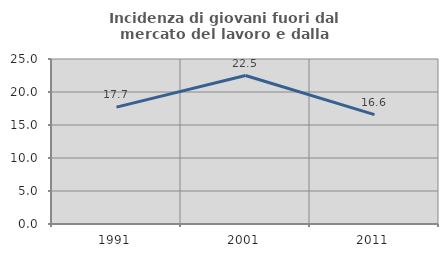
| Category | Incidenza di giovani fuori dal mercato del lavoro e dalla formazione  |
|---|---|
| 1991.0 | 17.714 |
| 2001.0 | 22.492 |
| 2011.0 | 16.566 |